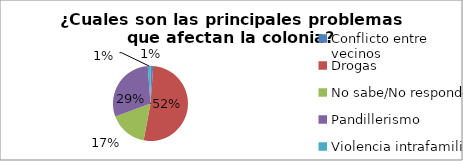
| Category | Series 0 |
|---|---|
| Conflicto entre vecinos  | 0.012 |
| Drogas | 0.518 |
| No sabe/No responde | 0.165 |
| Pandillerismo | 0.294 |
| Violencia intrafamiliar | 0.012 |